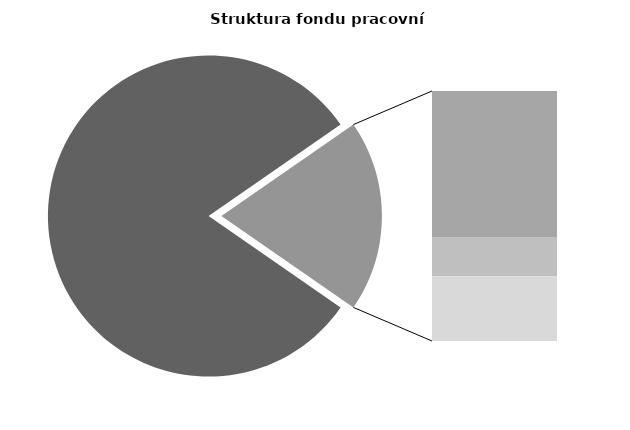
| Category | Series 0 |
|---|---|
| Průměrná měsíční odpracovaná doba bez přesčasu | 138.452 |
| Dovolená | 19.319 |
| Nemoc | 5.182 |
| Jiné | 8.571 |